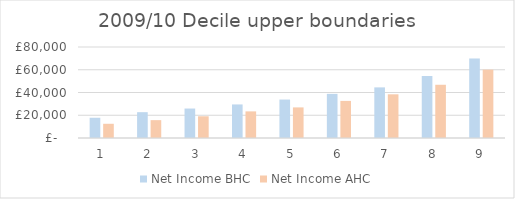
| Category | Net Income BHC | Net Income AHC |
|---|---|---|
| 0 | 17800 | 12500 |
| 1 | 22700 | 15700 |
| 2 | 25900 | 19100 |
| 3 | 29500 | 23400 |
| 4 | 33800 | 26900 |
| 5 | 38800 | 32600 |
| 6 | 44500 | 38400 |
| 7 | 54500 | 46800 |
| 8 | 69900 | 60100 |